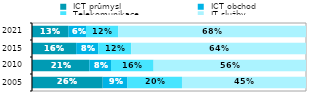
| Category |  ICT průmysl |  ICT obchod |  Telekomunikace |  IT služby  |
|---|---|---|---|---|
| 2005.0 | 0.258 | 0.09 | 0.199 | 0.453 |
| 2010.0 | 0.209 | 0.079 | 0.156 | 0.556 |
| 2015.0 | 0.161 | 0.08 | 0.12 | 0.638 |
| 2021.0 | 0.133 | 0.064 | 0.118 | 0.685 |